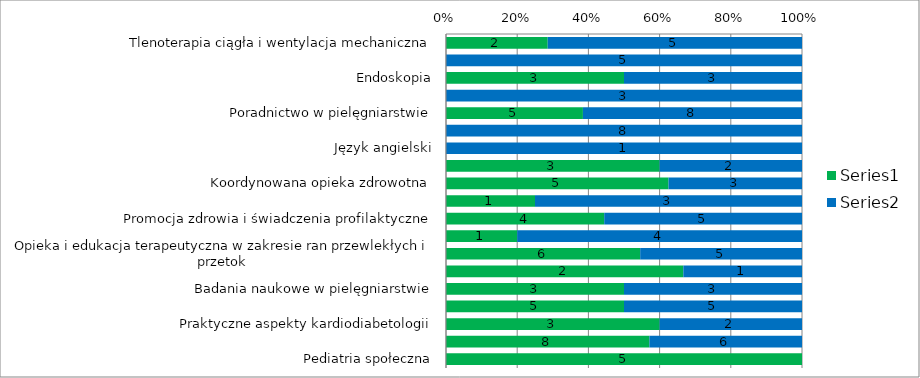
| Category | Series 0 | Series 1 |
|---|---|---|
| Tlenoterapia ciągła i wentylacja mechaniczna | 2 | 5 |
| Tlenoterapia ciągła i wentylacja mechaniczna - praktyka zawodowa | 0 | 5 |
| Endoskopia | 3 | 3 |
| Endoskopia - praktyka zawodowa | 0 | 3 |
| Poradnictwo w pielęgniarstwie | 5 | 8 |
| Poradnictwo w pielęgniarstwie - praktyka zawodowa | 0 | 8 |
| Język angielski | 0 | 1 |
| Dydaktyka medyczna | 3 | 2 |
| Koordynowana opieka zdrowotna | 5 | 3 |
| Leczenie żywieniowe | 1 | 3 |
| Promocja zdrowia i świadczenia profilaktyczne | 4 | 5 |
| Opieka i edukacja terapeutyczna w chorobach przewlekłych (leczenie p. bólowe) | 1 | 4 |
| Opieka i edukacja terapeutyczna w zakresie ran przewlekłych i przetok  | 6 | 5 |
| Opieka i edukacja terapeutyczna w transplantologii | 2 | 1 |
| Badania naukowe w pielęgniarstwie | 3 | 3 |
| Wybrane zagadnienia w neurologii dziecięcej | 5 | 5 |
| Praktyczne aspekty kardiodiabetologii | 3 | 2 |
| Chirurgia jednego dnia | 8 | 6 |
| Pediatria społeczna | 5 | 0 |